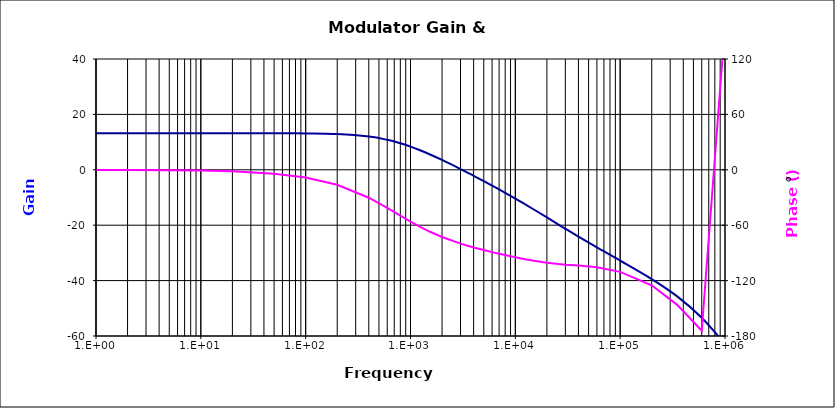
| Category | Series 0 |
|---|---|
| 1.0 | 13.232 |
| 2.0 | 13.232 |
| 5.0 | 13.232 |
| 10.0 | 13.231 |
| 20.0 | 13.228 |
| 50.0 | 13.21 |
| 100.0 | 13.144 |
| 200.0 | 12.889 |
| 400.0 | 11.996 |
| 600.0 | 10.824 |
| 800.0 | 9.581 |
| 1000.0 | 8.374 |
| 1200.0 | 7.246 |
| 1500.0 | 5.717 |
| 2000.0 | 3.559 |
| 3000.0 | 0.278 |
| 4000.0 | -2.161 |
| 5000.0 | -4.102 |
| 6000.0 | -5.718 |
| 7000.0 | -7.106 |
| 8000.0 | -8.326 |
| 9000.0 | -9.418 |
| 10000.0 | -10.407 |
| 12000.0 | -12.149 |
| 15000.0 | -14.331 |
| 20000.0 | -17.209 |
| 30000.0 | -21.294 |
| 40000.0 | -24.139 |
| 60000.0 | -28.025 |
| 100000.0 | -32.793 |
| 200000.0 | -39.465 |
| 350000.0 | -45.706 |
| 600000.0 | -53.417 |
| 1000000.0 | -62.917 |